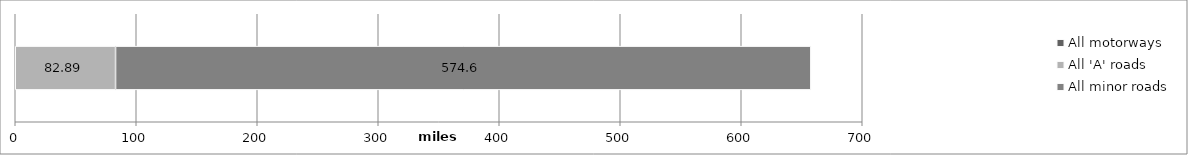
| Category | All motorways | All 'A' roads | All minor roads |
|---|---|---|---|
| Bath and North East Somerset | 0 | 82.89 | 574.6 |